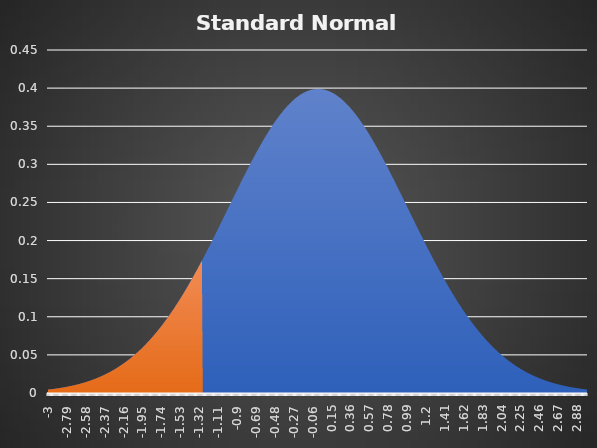
| Category | Area | Z-Value |
|---|---|---|
| -3.0 | 0.004 | 0.004 |
| -2.99 | 0.005 | 0.005 |
| -2.9800000000000004 | 0.005 | 0.005 |
| -2.9700000000000006 | 0.005 | 0.005 |
| -2.960000000000001 | 0.005 | 0.005 |
| -2.950000000000001 | 0.005 | 0.005 |
| -2.9400000000000013 | 0.005 | 0.005 |
| -2.9300000000000015 | 0.005 | 0.005 |
| -2.9200000000000017 | 0.006 | 0.006 |
| -2.910000000000002 | 0.006 | 0.006 |
| -2.900000000000002 | 0.006 | 0.006 |
| -2.8900000000000023 | 0.006 | 0.006 |
| -2.8800000000000026 | 0.006 | 0.006 |
| -2.8700000000000028 | 0.006 | 0.006 |
| -2.860000000000003 | 0.007 | 0.007 |
| -2.850000000000003 | 0.007 | 0.007 |
| -2.8400000000000034 | 0.007 | 0.007 |
| -2.8300000000000036 | 0.007 | 0.007 |
| -2.820000000000004 | 0.007 | 0.007 |
| -2.810000000000004 | 0.008 | 0.008 |
| -2.8000000000000043 | 0.008 | 0.008 |
| -2.7900000000000045 | 0.008 | 0.008 |
| -2.7800000000000047 | 0.008 | 0.008 |
| -2.770000000000005 | 0.009 | 0.009 |
| -2.760000000000005 | 0.009 | 0.009 |
| -2.7500000000000053 | 0.009 | 0.009 |
| -2.7400000000000055 | 0.009 | 0.009 |
| -2.7300000000000058 | 0.01 | 0.01 |
| -2.720000000000006 | 0.01 | 0.01 |
| -2.710000000000006 | 0.01 | 0.01 |
| -2.7000000000000064 | 0.01 | 0.01 |
| -2.6900000000000066 | 0.011 | 0.011 |
| -2.680000000000007 | 0.011 | 0.011 |
| -2.670000000000007 | 0.011 | 0.011 |
| -2.6600000000000072 | 0.012 | 0.012 |
| -2.6500000000000075 | 0.012 | 0.012 |
| -2.6400000000000077 | 0.012 | 0.012 |
| -2.630000000000008 | 0.013 | 0.013 |
| -2.620000000000008 | 0.013 | 0.013 |
| -2.6100000000000083 | 0.013 | 0.013 |
| -2.6000000000000085 | 0.014 | 0.014 |
| -2.5900000000000087 | 0.014 | 0.014 |
| -2.580000000000009 | 0.014 | 0.014 |
| -2.570000000000009 | 0.015 | 0.015 |
| -2.5600000000000094 | 0.015 | 0.015 |
| -2.5500000000000096 | 0.015 | 0.015 |
| -2.54000000000001 | 0.016 | 0.016 |
| -2.53000000000001 | 0.016 | 0.016 |
| -2.5200000000000102 | 0.017 | 0.017 |
| -2.5100000000000104 | 0.017 | 0.017 |
| -2.5000000000000107 | 0.018 | 0.018 |
| -2.490000000000011 | 0.018 | 0.018 |
| -2.480000000000011 | 0.018 | 0.018 |
| -2.4700000000000113 | 0.019 | 0.019 |
| -2.4600000000000115 | 0.019 | 0.019 |
| -2.4500000000000117 | 0.02 | 0.02 |
| -2.440000000000012 | 0.02 | 0.02 |
| -2.430000000000012 | 0.021 | 0.021 |
| -2.4200000000000124 | 0.021 | 0.021 |
| -2.4100000000000126 | 0.022 | 0.022 |
| -2.400000000000013 | 0.022 | 0.022 |
| -2.390000000000013 | 0.023 | 0.023 |
| -2.380000000000013 | 0.023 | 0.023 |
| -2.3700000000000134 | 0.024 | 0.024 |
| -2.3600000000000136 | 0.025 | 0.025 |
| -2.350000000000014 | 0.025 | 0.025 |
| -2.340000000000014 | 0.026 | 0.026 |
| -2.3300000000000143 | 0.026 | 0.026 |
| -2.3200000000000145 | 0.027 | 0.027 |
| -2.3100000000000147 | 0.028 | 0.028 |
| -2.300000000000015 | 0.028 | 0.028 |
| -2.290000000000015 | 0.029 | 0.029 |
| -2.2800000000000153 | 0.03 | 0.03 |
| -2.2700000000000156 | 0.03 | 0.03 |
| -2.2600000000000158 | 0.031 | 0.031 |
| -2.250000000000016 | 0.032 | 0.032 |
| -2.240000000000016 | 0.032 | 0.032 |
| -2.2300000000000164 | 0.033 | 0.033 |
| -2.2200000000000166 | 0.034 | 0.034 |
| -2.210000000000017 | 0.035 | 0.035 |
| -2.200000000000017 | 0.035 | 0.035 |
| -2.1900000000000173 | 0.036 | 0.036 |
| -2.1800000000000175 | 0.037 | 0.037 |
| -2.1700000000000177 | 0.038 | 0.038 |
| -2.160000000000018 | 0.039 | 0.039 |
| -2.150000000000018 | 0.04 | 0.04 |
| -2.1400000000000183 | 0.04 | 0.04 |
| -2.1300000000000185 | 0.041 | 0.041 |
| -2.1200000000000188 | 0.042 | 0.042 |
| -2.110000000000019 | 0.043 | 0.043 |
| -2.100000000000019 | 0.044 | 0.044 |
| -2.0900000000000194 | 0.045 | 0.045 |
| -2.0800000000000196 | 0.046 | 0.046 |
| -2.07000000000002 | 0.047 | 0.047 |
| -2.06000000000002 | 0.048 | 0.048 |
| -2.0500000000000203 | 0.049 | 0.049 |
| -2.0400000000000205 | 0.05 | 0.05 |
| -2.0300000000000207 | 0.051 | 0.051 |
| -2.020000000000021 | 0.052 | 0.052 |
| -2.010000000000021 | 0.053 | 0.053 |
| -2.0000000000000213 | 0.054 | 0.054 |
| -1.9900000000000213 | 0.055 | 0.055 |
| -1.9800000000000213 | 0.056 | 0.056 |
| -1.9700000000000213 | 0.057 | 0.057 |
| -1.9600000000000213 | 0.058 | 0.058 |
| -1.9500000000000213 | 0.06 | 0.06 |
| -1.9400000000000213 | 0.061 | 0.061 |
| -1.9300000000000213 | 0.062 | 0.062 |
| -1.9200000000000212 | 0.063 | 0.063 |
| -1.9100000000000212 | 0.064 | 0.064 |
| -1.9000000000000212 | 0.066 | 0.066 |
| -1.8900000000000212 | 0.067 | 0.067 |
| -1.8800000000000212 | 0.068 | 0.068 |
| -1.8700000000000212 | 0.069 | 0.069 |
| -1.8600000000000212 | 0.071 | 0.071 |
| -1.8500000000000212 | 0.072 | 0.072 |
| -1.8400000000000212 | 0.073 | 0.073 |
| -1.8300000000000212 | 0.075 | 0.075 |
| -1.8200000000000212 | 0.076 | 0.076 |
| -1.8100000000000211 | 0.078 | 0.078 |
| -1.8000000000000211 | 0.079 | 0.079 |
| -1.7900000000000211 | 0.08 | 0.08 |
| -1.7800000000000211 | 0.082 | 0.082 |
| -1.7700000000000211 | 0.083 | 0.083 |
| -1.760000000000021 | 0.085 | 0.085 |
| -1.750000000000021 | 0.086 | 0.086 |
| -1.740000000000021 | 0.088 | 0.088 |
| -1.730000000000021 | 0.089 | 0.089 |
| -1.720000000000021 | 0.091 | 0.091 |
| -1.710000000000021 | 0.092 | 0.092 |
| -1.700000000000021 | 0.094 | 0.094 |
| -1.690000000000021 | 0.096 | 0.096 |
| -1.680000000000021 | 0.097 | 0.097 |
| -1.670000000000021 | 0.099 | 0.099 |
| -1.660000000000021 | 0.101 | 0.101 |
| -1.650000000000021 | 0.102 | 0.102 |
| -1.640000000000021 | 0.104 | 0.104 |
| -1.630000000000021 | 0.106 | 0.106 |
| -1.620000000000021 | 0.107 | 0.107 |
| -1.610000000000021 | 0.109 | 0.109 |
| -1.600000000000021 | 0.111 | 0.111 |
| -1.590000000000021 | 0.113 | 0.113 |
| -1.580000000000021 | 0.115 | 0.115 |
| -1.570000000000021 | 0.116 | 0.116 |
| -1.560000000000021 | 0.118 | 0.118 |
| -1.550000000000021 | 0.12 | 0.12 |
| -1.540000000000021 | 0.122 | 0.122 |
| -1.530000000000021 | 0.124 | 0.124 |
| -1.520000000000021 | 0.126 | 0.126 |
| -1.5100000000000209 | 0.128 | 0.128 |
| -1.5000000000000209 | 0.13 | 0.13 |
| -1.4900000000000209 | 0.131 | 0.131 |
| -1.4800000000000209 | 0.133 | 0.133 |
| -1.4700000000000208 | 0.135 | 0.135 |
| -1.4600000000000208 | 0.137 | 0.137 |
| -1.4500000000000208 | 0.139 | 0.139 |
| -1.4400000000000208 | 0.141 | 0.141 |
| -1.4300000000000208 | 0.144 | 0.144 |
| -1.4200000000000208 | 0.146 | 0.146 |
| -1.4100000000000208 | 0.148 | 0.148 |
| -1.4000000000000208 | 0.15 | 0.15 |
| -1.3900000000000208 | 0.152 | 0.152 |
| -1.3800000000000208 | 0.154 | 0.154 |
| -1.3700000000000208 | 0.156 | 0.156 |
| -1.3600000000000207 | 0.158 | 0.158 |
| -1.3500000000000207 | 0.16 | 0.16 |
| -1.3400000000000207 | 0.163 | 0.163 |
| -1.3300000000000207 | 0.165 | 0.165 |
| -1.3200000000000207 | 0.167 | 0.167 |
| -1.3100000000000207 | 0.169 | 0.169 |
| -1.3000000000000207 | 0.171 | 0.171 |
| -1.2900000000000207 | 0.174 | 0.174 |
| -1.2800000000000207 | 0.176 | 0 |
| -1.2700000000000207 | 0.178 | 0 |
| -1.2600000000000207 | 0.18 | 0 |
| -1.2500000000000207 | 0.183 | 0 |
| -1.2400000000000206 | 0.185 | 0 |
| -1.2300000000000206 | 0.187 | 0 |
| -1.2200000000000206 | 0.19 | 0 |
| -1.2100000000000206 | 0.192 | 0 |
| -1.2000000000000206 | 0.194 | 0 |
| -1.1900000000000206 | 0.197 | 0 |
| -1.1800000000000206 | 0.199 | 0 |
| -1.1700000000000206 | 0.201 | 0 |
| -1.1600000000000206 | 0.204 | 0 |
| -1.1500000000000206 | 0.206 | 0 |
| -1.1400000000000206 | 0.208 | 0 |
| -1.1300000000000205 | 0.211 | 0 |
| -1.1200000000000205 | 0.213 | 0 |
| -1.1100000000000205 | 0.215 | 0 |
| -1.1000000000000205 | 0.218 | 0 |
| -1.0900000000000205 | 0.22 | 0 |
| -1.0800000000000205 | 0.223 | 0 |
| -1.0700000000000205 | 0.225 | 0 |
| -1.0600000000000205 | 0.227 | 0 |
| -1.0500000000000205 | 0.23 | 0 |
| -1.0400000000000205 | 0.232 | 0 |
| -1.0300000000000205 | 0.235 | 0 |
| -1.0200000000000204 | 0.237 | 0 |
| -1.0100000000000204 | 0.24 | 0 |
| -1.0000000000000204 | 0.242 | 0 |
| -0.9900000000000204 | 0.244 | 0 |
| -0.9800000000000204 | 0.247 | 0 |
| -0.9700000000000204 | 0.249 | 0 |
| -0.9600000000000204 | 0.252 | 0 |
| -0.9500000000000204 | 0.254 | 0 |
| -0.9400000000000204 | 0.256 | 0 |
| -0.9300000000000204 | 0.259 | 0 |
| -0.9200000000000204 | 0.261 | 0 |
| -0.9100000000000203 | 0.264 | 0 |
| -0.9000000000000203 | 0.266 | 0 |
| -0.8900000000000203 | 0.268 | 0 |
| -0.8800000000000203 | 0.271 | 0 |
| -0.8700000000000203 | 0.273 | 0 |
| -0.8600000000000203 | 0.276 | 0 |
| -0.8500000000000203 | 0.278 | 0 |
| -0.8400000000000203 | 0.28 | 0 |
| -0.8300000000000203 | 0.283 | 0 |
| -0.8200000000000203 | 0.285 | 0 |
| -0.8100000000000203 | 0.287 | 0 |
| -0.8000000000000203 | 0.29 | 0 |
| -0.7900000000000202 | 0.292 | 0 |
| -0.7800000000000202 | 0.294 | 0 |
| -0.7700000000000202 | 0.297 | 0 |
| -0.7600000000000202 | 0.299 | 0 |
| -0.7500000000000202 | 0.301 | 0 |
| -0.7400000000000202 | 0.303 | 0 |
| -0.7300000000000202 | 0.306 | 0 |
| -0.7200000000000202 | 0.308 | 0 |
| -0.7100000000000202 | 0.31 | 0 |
| -0.7000000000000202 | 0.312 | 0 |
| -0.6900000000000202 | 0.314 | 0 |
| -0.6800000000000201 | 0.317 | 0 |
| -0.6700000000000201 | 0.319 | 0 |
| -0.6600000000000201 | 0.321 | 0 |
| -0.6500000000000201 | 0.323 | 0 |
| -0.6400000000000201 | 0.325 | 0 |
| -0.6300000000000201 | 0.327 | 0 |
| -0.6200000000000201 | 0.329 | 0 |
| -0.6100000000000201 | 0.331 | 0 |
| -0.6000000000000201 | 0.333 | 0 |
| -0.5900000000000201 | 0.335 | 0 |
| -0.58000000000002 | 0.337 | 0 |
| -0.57000000000002 | 0.339 | 0 |
| -0.56000000000002 | 0.341 | 0 |
| -0.55000000000002 | 0.343 | 0 |
| -0.54000000000002 | 0.345 | 0 |
| -0.53000000000002 | 0.347 | 0 |
| -0.52000000000002 | 0.348 | 0 |
| -0.51000000000002 | 0.35 | 0 |
| -0.50000000000002 | 0.352 | 0 |
| -0.49000000000002 | 0.354 | 0 |
| -0.48000000000001997 | 0.356 | 0 |
| -0.47000000000001996 | 0.357 | 0 |
| -0.46000000000001995 | 0.359 | 0 |
| -0.45000000000001994 | 0.361 | 0 |
| -0.44000000000001993 | 0.362 | 0 |
| -0.4300000000000199 | 0.364 | 0 |
| -0.4200000000000199 | 0.365 | 0 |
| -0.4100000000000199 | 0.367 | 0 |
| -0.4000000000000199 | 0.368 | 0 |
| -0.3900000000000199 | 0.37 | 0 |
| -0.3800000000000199 | 0.371 | 0 |
| -0.37000000000001987 | 0.373 | 0 |
| -0.36000000000001986 | 0.374 | 0 |
| -0.35000000000001985 | 0.375 | 0 |
| -0.34000000000001984 | 0.377 | 0 |
| -0.33000000000001983 | 0.378 | 0 |
| -0.3200000000000198 | 0.379 | 0 |
| -0.3100000000000198 | 0.38 | 0 |
| -0.3000000000000198 | 0.381 | 0 |
| -0.2900000000000198 | 0.383 | 0 |
| -0.2800000000000198 | 0.384 | 0 |
| -0.2700000000000198 | 0.385 | 0 |
| -0.26000000000001977 | 0.386 | 0 |
| -0.25000000000001976 | 0.387 | 0 |
| -0.24000000000001975 | 0.388 | 0 |
| -0.23000000000001974 | 0.389 | 0 |
| -0.22000000000001974 | 0.389 | 0 |
| -0.21000000000001973 | 0.39 | 0 |
| -0.20000000000001972 | 0.391 | 0 |
| -0.1900000000000197 | 0.392 | 0 |
| -0.1800000000000197 | 0.393 | 0 |
| -0.1700000000000197 | 0.393 | 0 |
| -0.16000000000001968 | 0.394 | 0 |
| -0.15000000000001967 | 0.394 | 0 |
| -0.14000000000001966 | 0.395 | 0 |
| -0.13000000000001966 | 0.396 | 0 |
| -0.12000000000001966 | 0.396 | 0 |
| -0.11000000000001967 | 0.397 | 0 |
| -0.10000000000001967 | 0.397 | 0 |
| -0.09000000000001968 | 0.397 | 0 |
| -0.08000000000001968 | 0.398 | 0 |
| -0.07000000000001969 | 0.398 | 0 |
| -0.06000000000001968 | 0.398 | 0 |
| -0.05000000000001968 | 0.398 | 0 |
| -0.04000000000001968 | 0.399 | 0 |
| -0.030000000000019678 | 0.399 | 0 |
| -0.020000000000019676 | 0.399 | 0 |
| -0.010000000000019675 | 0.399 | 0 |
| 0.0 | 0.399 | 0 |
| 0.01 | 0.399 | 0 |
| 0.02 | 0.399 | 0 |
| 0.03 | 0.399 | 0 |
| 0.04 | 0.399 | 0 |
| 0.05 | 0.398 | 0 |
| 0.060000000000000005 | 0.398 | 0 |
| 0.07 | 0.398 | 0 |
| 0.08 | 0.398 | 0 |
| 0.09 | 0.397 | 0 |
| 0.09999999999999999 | 0.397 | 0 |
| 0.10999999999999999 | 0.397 | 0 |
| 0.11999999999999998 | 0.396 | 0 |
| 0.12999999999999998 | 0.396 | 0 |
| 0.13999999999999999 | 0.395 | 0 |
| 0.15 | 0.394 | 0 |
| 0.16 | 0.394 | 0 |
| 0.17 | 0.393 | 0 |
| 0.18000000000000002 | 0.393 | 0 |
| 0.19000000000000003 | 0.392 | 0 |
| 0.20000000000000004 | 0.391 | 0 |
| 0.21000000000000005 | 0.39 | 0 |
| 0.22000000000000006 | 0.389 | 0 |
| 0.23000000000000007 | 0.389 | 0 |
| 0.24000000000000007 | 0.388 | 0 |
| 0.25000000000000006 | 0.387 | 0 |
| 0.26000000000000006 | 0.386 | 0 |
| 0.2700000000000001 | 0.385 | 0 |
| 0.2800000000000001 | 0.384 | 0 |
| 0.2900000000000001 | 0.383 | 0 |
| 0.3000000000000001 | 0.381 | 0 |
| 0.3100000000000001 | 0.38 | 0 |
| 0.3200000000000001 | 0.379 | 0 |
| 0.3300000000000001 | 0.378 | 0 |
| 0.34000000000000014 | 0.377 | 0 |
| 0.35000000000000014 | 0.375 | 0 |
| 0.36000000000000015 | 0.374 | 0 |
| 0.37000000000000016 | 0.373 | 0 |
| 0.38000000000000017 | 0.371 | 0 |
| 0.3900000000000002 | 0.37 | 0 |
| 0.4000000000000002 | 0.368 | 0 |
| 0.4100000000000002 | 0.367 | 0 |
| 0.4200000000000002 | 0.365 | 0 |
| 0.4300000000000002 | 0.364 | 0 |
| 0.4400000000000002 | 0.362 | 0 |
| 0.45000000000000023 | 0.361 | 0 |
| 0.46000000000000024 | 0.359 | 0 |
| 0.47000000000000025 | 0.357 | 0 |
| 0.48000000000000026 | 0.356 | 0 |
| 0.49000000000000027 | 0.354 | 0 |
| 0.5000000000000002 | 0.352 | 0 |
| 0.5100000000000002 | 0.35 | 0 |
| 0.5200000000000002 | 0.348 | 0 |
| 0.5300000000000002 | 0.347 | 0 |
| 0.5400000000000003 | 0.345 | 0 |
| 0.5500000000000003 | 0.343 | 0 |
| 0.5600000000000003 | 0.341 | 0 |
| 0.5700000000000003 | 0.339 | 0 |
| 0.5800000000000003 | 0.337 | 0 |
| 0.5900000000000003 | 0.335 | 0 |
| 0.6000000000000003 | 0.333 | 0 |
| 0.6100000000000003 | 0.331 | 0 |
| 0.6200000000000003 | 0.329 | 0 |
| 0.6300000000000003 | 0.327 | 0 |
| 0.6400000000000003 | 0.325 | 0 |
| 0.6500000000000004 | 0.323 | 0 |
| 0.6600000000000004 | 0.321 | 0 |
| 0.6700000000000004 | 0.319 | 0 |
| 0.6800000000000004 | 0.317 | 0 |
| 0.6900000000000004 | 0.314 | 0 |
| 0.7000000000000004 | 0.312 | 0 |
| 0.7100000000000004 | 0.31 | 0 |
| 0.7200000000000004 | 0.308 | 0 |
| 0.7300000000000004 | 0.306 | 0 |
| 0.7400000000000004 | 0.303 | 0 |
| 0.7500000000000004 | 0.301 | 0 |
| 0.7600000000000005 | 0.299 | 0 |
| 0.7700000000000005 | 0.297 | 0 |
| 0.7800000000000005 | 0.294 | 0 |
| 0.7900000000000005 | 0.292 | 0 |
| 0.8000000000000005 | 0.29 | 0 |
| 0.8100000000000005 | 0.287 | 0 |
| 0.8200000000000005 | 0.285 | 0 |
| 0.8300000000000005 | 0.283 | 0 |
| 0.8400000000000005 | 0.28 | 0 |
| 0.8500000000000005 | 0.278 | 0 |
| 0.8600000000000005 | 0.276 | 0 |
| 0.8700000000000006 | 0.273 | 0 |
| 0.8800000000000006 | 0.271 | 0 |
| 0.8900000000000006 | 0.268 | 0 |
| 0.9000000000000006 | 0.266 | 0 |
| 0.9100000000000006 | 0.264 | 0 |
| 0.9200000000000006 | 0.261 | 0 |
| 0.9300000000000006 | 0.259 | 0 |
| 0.9400000000000006 | 0.256 | 0 |
| 0.9500000000000006 | 0.254 | 0 |
| 0.9600000000000006 | 0.252 | 0 |
| 0.9700000000000006 | 0.249 | 0 |
| 0.9800000000000006 | 0.247 | 0 |
| 0.9900000000000007 | 0.244 | 0 |
| 1.0000000000000007 | 0.242 | 0 |
| 1.0100000000000007 | 0.24 | 0 |
| 1.0200000000000007 | 0.237 | 0 |
| 1.0300000000000007 | 0.235 | 0 |
| 1.0400000000000007 | 0.232 | 0 |
| 1.0500000000000007 | 0.23 | 0 |
| 1.0600000000000007 | 0.227 | 0 |
| 1.0700000000000007 | 0.225 | 0 |
| 1.0800000000000007 | 0.223 | 0 |
| 1.0900000000000007 | 0.22 | 0 |
| 1.1000000000000008 | 0.218 | 0 |
| 1.1100000000000008 | 0.215 | 0 |
| 1.1200000000000008 | 0.213 | 0 |
| 1.1300000000000008 | 0.211 | 0 |
| 1.1400000000000008 | 0.208 | 0 |
| 1.1500000000000008 | 0.206 | 0 |
| 1.1600000000000008 | 0.204 | 0 |
| 1.1700000000000008 | 0.201 | 0 |
| 1.1800000000000008 | 0.199 | 0 |
| 1.1900000000000008 | 0.197 | 0 |
| 1.2000000000000008 | 0.194 | 0 |
| 1.2100000000000009 | 0.192 | 0 |
| 1.2200000000000009 | 0.19 | 0 |
| 1.2300000000000009 | 0.187 | 0 |
| 1.2400000000000009 | 0.185 | 0 |
| 1.2500000000000009 | 0.183 | 0 |
| 1.260000000000001 | 0.18 | 0 |
| 1.270000000000001 | 0.178 | 0 |
| 1.280000000000001 | 0.176 | 0 |
| 1.290000000000001 | 0.174 | 0 |
| 1.300000000000001 | 0.171 | 0 |
| 1.310000000000001 | 0.169 | 0 |
| 1.320000000000001 | 0.167 | 0 |
| 1.330000000000001 | 0.165 | 0 |
| 1.340000000000001 | 0.163 | 0 |
| 1.350000000000001 | 0.16 | 0 |
| 1.360000000000001 | 0.158 | 0 |
| 1.370000000000001 | 0.156 | 0 |
| 1.380000000000001 | 0.154 | 0 |
| 1.390000000000001 | 0.152 | 0 |
| 1.400000000000001 | 0.15 | 0 |
| 1.410000000000001 | 0.148 | 0 |
| 1.420000000000001 | 0.146 | 0 |
| 1.430000000000001 | 0.144 | 0 |
| 1.440000000000001 | 0.141 | 0 |
| 1.450000000000001 | 0.139 | 0 |
| 1.460000000000001 | 0.137 | 0 |
| 1.470000000000001 | 0.135 | 0 |
| 1.480000000000001 | 0.133 | 0 |
| 1.490000000000001 | 0.131 | 0 |
| 1.500000000000001 | 0.13 | 0 |
| 1.5100000000000011 | 0.128 | 0 |
| 1.5200000000000011 | 0.126 | 0 |
| 1.5300000000000011 | 0.124 | 0 |
| 1.5400000000000011 | 0.122 | 0 |
| 1.5500000000000012 | 0.12 | 0 |
| 1.5600000000000012 | 0.118 | 0 |
| 1.5700000000000012 | 0.116 | 0 |
| 1.5800000000000012 | 0.115 | 0 |
| 1.5900000000000012 | 0.113 | 0 |
| 1.6000000000000012 | 0.111 | 0 |
| 1.6100000000000012 | 0.109 | 0 |
| 1.6200000000000012 | 0.107 | 0 |
| 1.6300000000000012 | 0.106 | 0 |
| 1.6400000000000012 | 0.104 | 0 |
| 1.6500000000000012 | 0.102 | 0 |
| 1.6600000000000013 | 0.101 | 0 |
| 1.6700000000000013 | 0.099 | 0 |
| 1.6800000000000013 | 0.097 | 0 |
| 1.6900000000000013 | 0.096 | 0 |
| 1.7000000000000013 | 0.094 | 0 |
| 1.7100000000000013 | 0.092 | 0 |
| 1.7200000000000013 | 0.091 | 0 |
| 1.7300000000000013 | 0.089 | 0 |
| 1.7400000000000013 | 0.088 | 0 |
| 1.7500000000000013 | 0.086 | 0 |
| 1.7600000000000013 | 0.085 | 0 |
| 1.7700000000000014 | 0.083 | 0 |
| 1.7800000000000014 | 0.082 | 0 |
| 1.7900000000000014 | 0.08 | 0 |
| 1.8000000000000014 | 0.079 | 0 |
| 1.8100000000000014 | 0.078 | 0 |
| 1.8200000000000014 | 0.076 | 0 |
| 1.8300000000000014 | 0.075 | 0 |
| 1.8400000000000014 | 0.073 | 0 |
| 1.8500000000000014 | 0.072 | 0 |
| 1.8600000000000014 | 0.071 | 0 |
| 1.8700000000000014 | 0.069 | 0 |
| 1.8800000000000014 | 0.068 | 0 |
| 1.8900000000000015 | 0.067 | 0 |
| 1.9000000000000015 | 0.066 | 0 |
| 1.9100000000000015 | 0.064 | 0 |
| 1.9200000000000015 | 0.063 | 0 |
| 1.9300000000000015 | 0.062 | 0 |
| 1.9400000000000015 | 0.061 | 0 |
| 1.9500000000000015 | 0.06 | 0 |
| 1.9600000000000015 | 0.058 | 0 |
| 1.9700000000000015 | 0.057 | 0 |
| 1.9800000000000015 | 0.056 | 0 |
| 1.9900000000000015 | 0.055 | 0 |
| 2.0000000000000013 | 0.054 | 0 |
| 2.010000000000001 | 0.053 | 0 |
| 2.020000000000001 | 0.052 | 0 |
| 2.0300000000000007 | 0.051 | 0 |
| 2.0400000000000005 | 0.05 | 0 |
| 2.0500000000000003 | 0.049 | 0 |
| 2.06 | 0.048 | 0 |
| 2.07 | 0.047 | 0 |
| 2.0799999999999996 | 0.046 | 0 |
| 2.0899999999999994 | 0.045 | 0 |
| 2.099999999999999 | 0.044 | 0 |
| 2.109999999999999 | 0.043 | 0 |
| 2.1199999999999988 | 0.042 | 0 |
| 2.1299999999999986 | 0.041 | 0 |
| 2.1399999999999983 | 0.04 | 0 |
| 2.149999999999998 | 0.04 | 0 |
| 2.159999999999998 | 0.039 | 0 |
| 2.1699999999999977 | 0.038 | 0 |
| 2.1799999999999975 | 0.037 | 0 |
| 2.1899999999999973 | 0.036 | 0 |
| 2.199999999999997 | 0.035 | 0 |
| 2.209999999999997 | 0.035 | 0 |
| 2.2199999999999966 | 0.034 | 0 |
| 2.2299999999999964 | 0.033 | 0 |
| 2.239999999999996 | 0.032 | 0 |
| 2.249999999999996 | 0.032 | 0 |
| 2.259999999999996 | 0.031 | 0 |
| 2.2699999999999956 | 0.03 | 0 |
| 2.2799999999999954 | 0.03 | 0 |
| 2.289999999999995 | 0.029 | 0 |
| 2.299999999999995 | 0.028 | 0 |
| 2.3099999999999947 | 0.028 | 0 |
| 2.3199999999999945 | 0.027 | 0 |
| 2.3299999999999943 | 0.026 | 0 |
| 2.339999999999994 | 0.026 | 0 |
| 2.349999999999994 | 0.025 | 0 |
| 2.3599999999999937 | 0.025 | 0 |
| 2.3699999999999934 | 0.024 | 0 |
| 2.3799999999999932 | 0.023 | 0 |
| 2.389999999999993 | 0.023 | 0 |
| 2.399999999999993 | 0.022 | 0 |
| 2.4099999999999926 | 0.022 | 0 |
| 2.4199999999999924 | 0.021 | 0 |
| 2.429999999999992 | 0.021 | 0 |
| 2.439999999999992 | 0.02 | 0 |
| 2.4499999999999917 | 0.02 | 0 |
| 2.4599999999999915 | 0.019 | 0 |
| 2.4699999999999913 | 0.019 | 0 |
| 2.479999999999991 | 0.018 | 0 |
| 2.489999999999991 | 0.018 | 0 |
| 2.4999999999999907 | 0.018 | 0 |
| 2.5099999999999905 | 0.017 | 0 |
| 2.5199999999999902 | 0.017 | 0 |
| 2.52999999999999 | 0.016 | 0 |
| 2.53999999999999 | 0.016 | 0 |
| 2.5499999999999896 | 0.015 | 0 |
| 2.5599999999999894 | 0.015 | 0 |
| 2.569999999999989 | 0.015 | 0 |
| 2.579999999999989 | 0.014 | 0 |
| 2.5899999999999888 | 0.014 | 0 |
| 2.5999999999999885 | 0.014 | 0 |
| 2.6099999999999883 | 0.013 | 0 |
| 2.619999999999988 | 0.013 | 0 |
| 2.629999999999988 | 0.013 | 0 |
| 2.6399999999999877 | 0.012 | 0 |
| 2.6499999999999875 | 0.012 | 0 |
| 2.6599999999999873 | 0.012 | 0 |
| 2.669999999999987 | 0.011 | 0 |
| 2.679999999999987 | 0.011 | 0 |
| 2.6899999999999866 | 0.011 | 0 |
| 2.6999999999999864 | 0.01 | 0 |
| 2.709999999999986 | 0.01 | 0 |
| 2.719999999999986 | 0.01 | 0 |
| 2.7299999999999858 | 0.01 | 0 |
| 2.7399999999999856 | 0.009 | 0 |
| 2.7499999999999853 | 0.009 | 0 |
| 2.759999999999985 | 0.009 | 0 |
| 2.769999999999985 | 0.009 | 0 |
| 2.7799999999999847 | 0.008 | 0 |
| 2.7899999999999845 | 0.008 | 0 |
| 2.7999999999999843 | 0.008 | 0 |
| 2.809999999999984 | 0.008 | 0 |
| 2.819999999999984 | 0.007 | 0 |
| 2.8299999999999836 | 0.007 | 0 |
| 2.8399999999999834 | 0.007 | 0 |
| 2.849999999999983 | 0.007 | 0 |
| 2.859999999999983 | 0.007 | 0 |
| 2.869999999999983 | 0.006 | 0 |
| 2.8799999999999826 | 0.006 | 0 |
| 2.8899999999999824 | 0.006 | 0 |
| 2.899999999999982 | 0.006 | 0 |
| 2.909999999999982 | 0.006 | 0 |
| 2.9199999999999817 | 0.006 | 0 |
| 2.9299999999999815 | 0.005 | 0 |
| 2.9399999999999813 | 0.005 | 0 |
| 2.949999999999981 | 0.005 | 0 |
| 2.959999999999981 | 0.005 | 0 |
| 2.9699999999999807 | 0.005 | 0 |
| 2.9799999999999804 | 0.005 | 0 |
| 2.9899999999999802 | 0.005 | 0 |
| 2.99999999999998 | 0.004 | 0 |